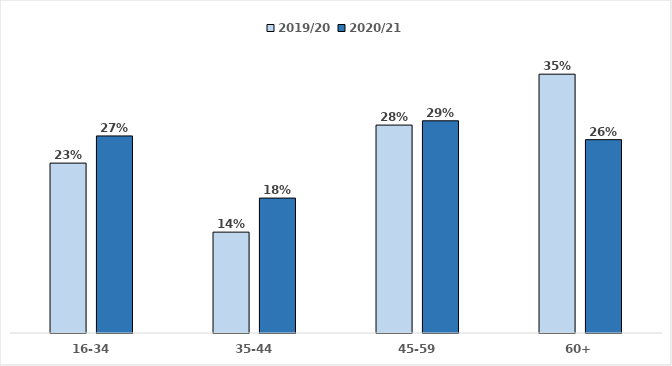
| Category | 2019/20 | 2020/21 |
|---|---|---|
| 16-34 | 0.23 | 0.267 |
| 35-44 | 0.137 | 0.183 |
| 45-59 | 0.282 | 0.288 |
| 60+ | 0.351 | 0.262 |